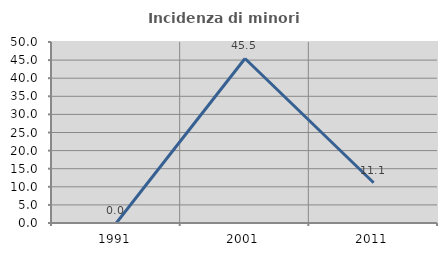
| Category | Incidenza di minori stranieri |
|---|---|
| 1991.0 | 0 |
| 2001.0 | 45.455 |
| 2011.0 | 11.111 |